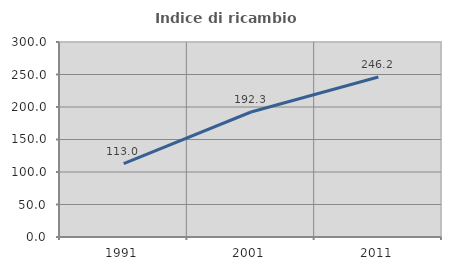
| Category | Indice di ricambio occupazionale  |
|---|---|
| 1991.0 | 113.043 |
| 2001.0 | 192.308 |
| 2011.0 | 246.154 |